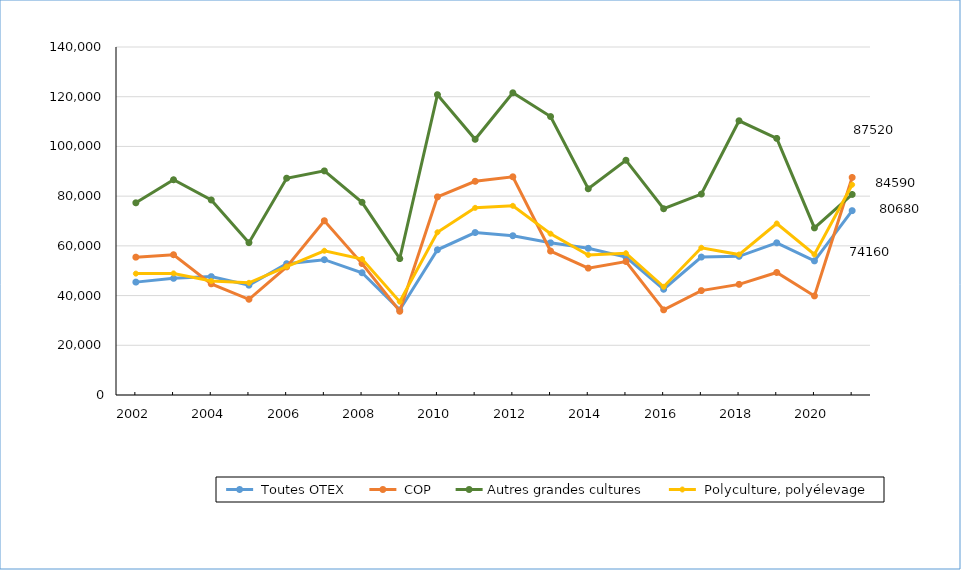
| Category |  Toutes OTEX |  COP | Autres grandes cultures |  Polyculture, polyélevage |
|---|---|---|---|---|
| 2002 | 45412.403 | 55451.286 | 77318.65 | 48832.112 |
| 2003 | 46936.429 | 56433.092 | 86590.693 | 48915.575 |
| 2004 | 47629.171 | 44716.213 | 78461.306 | 45830.136 |
| 2005 | 44179.795 | 38510.677 | 61278.38 | 45130.413 |
| 2006 | 52823.06 | 51536.929 | 87210.291 | 51631.253 |
| 2007 | 54432.519 | 70105.396 | 90159.512 | 58026.57 |
| 2008 | 49177.532 | 52862.177 | 77525.307 | 54713.271 |
| 2009 | 34221.355 | 33690.488 | 54852.55 | 37539.262 |
| 2010 | 58423.877 | 79701.871 | 120813.72 | 65460.087 |
| 2011 | 65356.49 | 85968.074 | 102873.231 | 75295.112 |
| 2012 | 64073.641 | 87777.978 | 121567.817 | 76106.167 |
| 2013 | 61212.101 | 57911.68 | 112014.515 | 64890.254 |
| 2014 | 59012.849 | 51046.004 | 82952.407 | 56341.695 |
| 2015 | 55489.439 | 53696.549 | 94439.079 | 57024.228 |
| 2016 | 42537.335 | 34255.587 | 74926.741 | 43531.081 |
| 2017 | 55500.017 | 41998.873 | 80837.54 | 59231.777 |
| 2018 | 55791.872 | 44511.906 | 110323.029 | 56505.907 |
| 2019 | 61224 | 49292 | 103238 | 69000 |
| 2020 | 53951 | 39863 | 67221 | 56530 |
| 2021 | 74160 | 87520 | 80680 | 84590 |